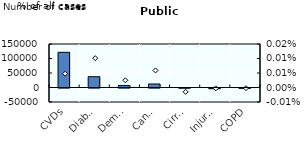
| Category | Number of cases |
|---|---|
| CVDs | 121330.437 |
| Diabetes | 37221.347 |
| Dementia | 7046.341 |
| Cancers | 12097.425 |
| Cirrhosis | -645.456 |
| Injuries | -2284.048 |
| COPD | -1207.805 |